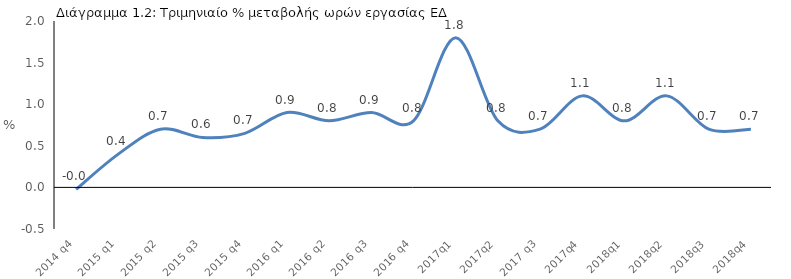
| Category | Series 0 |
|---|---|
| 2014 q4 | -0.023 |
| 2015 q1 | 0.4 |
| 2015 q2 | 0.7 |
| 2015 q3 | 0.6 |
| 2015 q4 | 0.65 |
| 2016 q1 | 0.9 |
| 2016 q2 | 0.8 |
| 2016 q3 | 0.9 |
| 2016 q4 | 0.8 |
| 2017q1 | 1.8 |
| 2017q2 | 0.8 |
| 2017 q3 | 0.7 |
| 2017q4 | 1.1 |
| 2018q1 | 0.8 |
| 2018q2 | 1.1 |
| 2018q3 | 0.7 |
| 2018q4 | 0.7 |